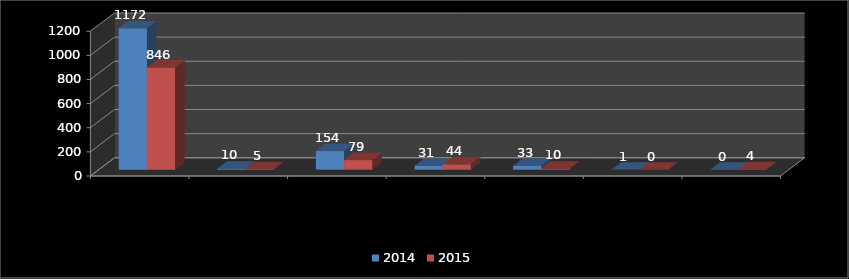
| Category | 2014 | 2015 |
|---|---|---|
| ADJUDICACION DIRECTA  | 1172 | 846 |
| INVITACION A TRES PERSONAS  | 10 | 5 |
| LICITACION PUBLICA INTERNACIONAL  | 154 | 79 |
| LICITACION PUBLICA NACIONAL  | 31 | 44 |
| EXCEPCIÓN DE LICITACIÓN | 33 | 10 |
| CONTRATO MARCO | 1 | 0 |
| EXCEPCION A UNA INVITACION A CUANDO MENOS TRES PERSONAS  | 0 | 4 |